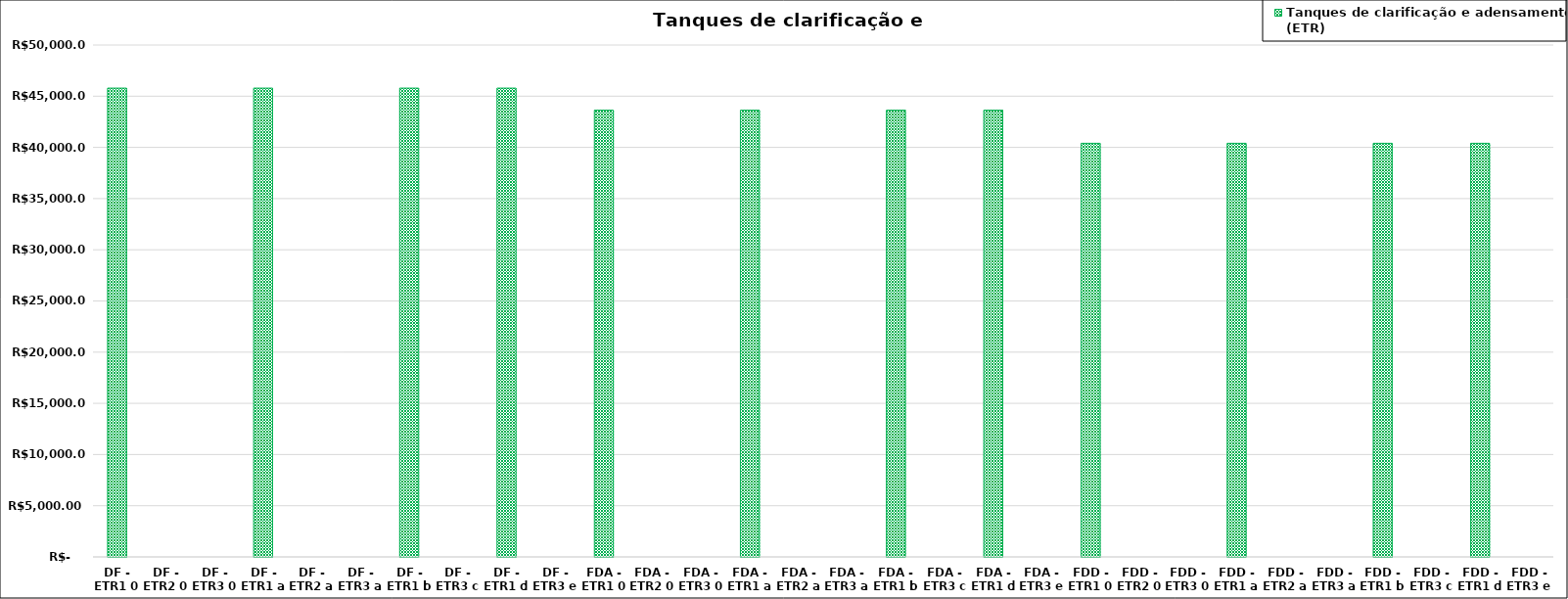
| Category | Tanques de clarificação e adensamento (ETR) |
|---|---|
| DF - ETR1 0 | 45788.879 |
| DF - ETR2 0 | 0 |
| DF - ETR3 0 | 0 |
| DF - ETR1 a | 45788.879 |
| DF - ETR2 a | 0 |
| DF - ETR3 a | 0 |
| DF - ETR1 b | 45788.879 |
| DF - ETR3 c | 0 |
| DF - ETR1 d | 45788.879 |
| DF - ETR3 e | 0 |
| FDA - ETR1 0 | 43635.072 |
| FDA - ETR2 0 | 0 |
| FDA - ETR3 0 | 0 |
| FDA - ETR1 a | 43635.072 |
| FDA - ETR2 a | 0 |
| FDA - ETR3 a | 0 |
| FDA - ETR1 b | 43635.072 |
| FDA - ETR3 c | 0 |
| FDA - ETR1 d | 43635.072 |
| FDA - ETR3 e | 0 |
| FDD - ETR1 0 | 40401.897 |
| FDD - ETR2 0 | 0 |
| FDD - ETR3 0 | 0 |
| FDD - ETR1 a | 40401.897 |
| FDD - ETR2 a | 0 |
| FDD - ETR3 a | 0 |
| FDD - ETR1 b | 40401.897 |
| FDD - ETR3 c | 0 |
| FDD - ETR1 d | 40401.897 |
| FDD - ETR3 e | 0 |